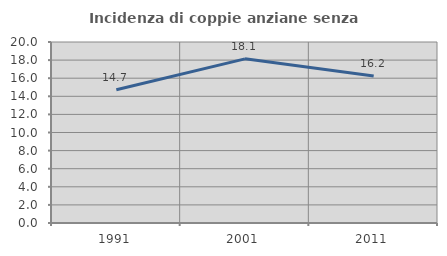
| Category | Incidenza di coppie anziane senza figli  |
|---|---|
| 1991.0 | 14.721 |
| 2001.0 | 18.137 |
| 2011.0 | 16.239 |